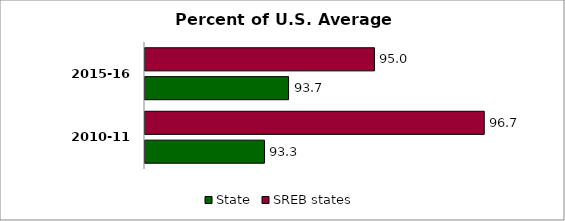
| Category | State | SREB states |
|---|---|---|
| 2010-11 | 93.347 | 96.746 |
| 2015-16 | 93.72 | 95.048 |